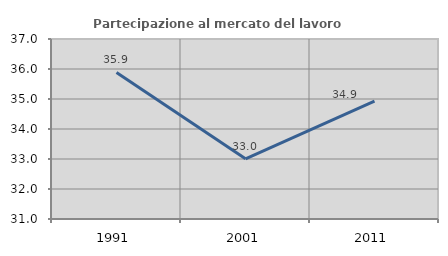
| Category | Partecipazione al mercato del lavoro  femminile |
|---|---|
| 1991.0 | 35.887 |
| 2001.0 | 33.006 |
| 2011.0 | 34.93 |